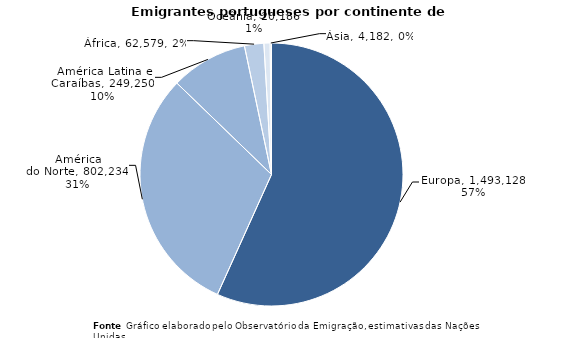
| Category | Series 0 |
|---|---|
| Europa | 1493128 |
| América
do Norte | 802234 |
| América Latina e Caraíbas | 249250 |
| África | 62579 |
| Oceânia | 20186 |
| Ásia | 4182 |